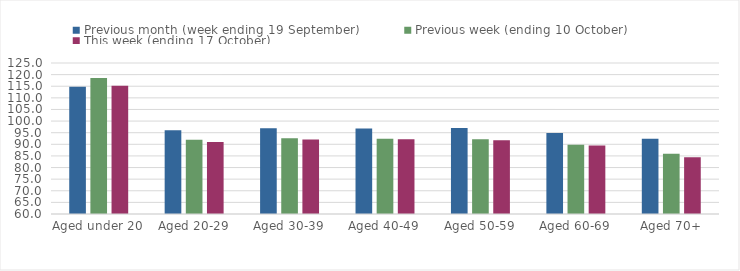
| Category | Previous month (week ending 19 September) | Previous week (ending 10 October) | This week (ending 17 October) |
|---|---|---|---|
| Aged under 20 | 114.77 | 118.53 | 115.19 |
| Aged 20-29 | 96.09 | 92 | 90.95 |
| Aged 30-39 | 96.89 | 92.57 | 92.11 |
| Aged 40-49 | 96.8 | 92.36 | 92.23 |
| Aged 50-59 | 97.02 | 92.16 | 91.8 |
| Aged 60-69 | 94.92 | 89.79 | 89.49 |
| Aged 70+ | 92.43 | 85.9 | 84.46 |